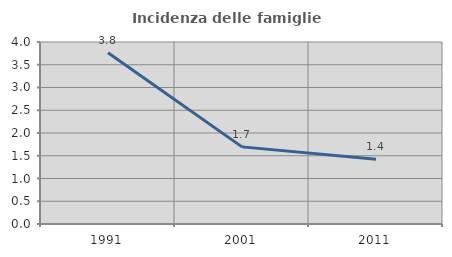
| Category | Incidenza delle famiglie numerose |
|---|---|
| 1991.0 | 3.762 |
| 2001.0 | 1.695 |
| 2011.0 | 1.421 |